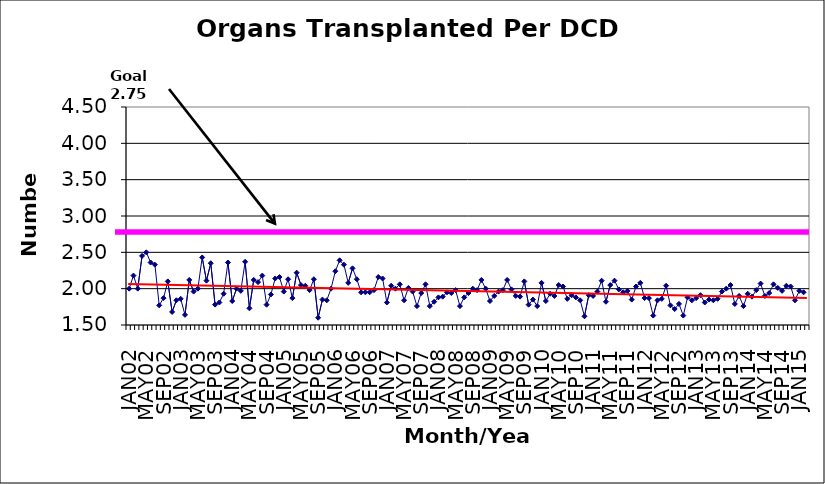
| Category | Series 0 |
|---|---|
| JAN02 | 2 |
| FEB02 | 2.18 |
| MAR02 | 2 |
| APR02 | 2.45 |
| MAY02 | 2.5 |
| JUN02 | 2.36 |
| JUL02 | 2.33 |
| AUG02 | 1.77 |
| SEP02 | 1.87 |
| OCT02 | 2.1 |
| NOV02 | 1.68 |
| DEC02 | 1.84 |
| JAN03 | 1.86 |
| FEB03 | 1.64 |
| MAR03 | 2.12 |
| APR03 | 1.96 |
| MAY03 | 2 |
| JUN03 | 2.43 |
| JUL03 | 2.11 |
| AUG03 | 2.35 |
| SEP03 | 1.78 |
| OCT03 | 1.81 |
| NOV03 | 1.93 |
| DEC03 | 2.36 |
| JAN04 | 1.83 |
| FEB04 | 2 |
| MAR04 | 1.97 |
| APR04 | 2.37 |
| MAY04 | 1.73 |
| JUN04 | 2.12 |
| JUL04 | 2.09 |
| AUG04 | 2.18 |
| SEP04 | 1.78 |
| OCT04 | 1.92 |
| NOV04 | 2.14 |
| DEC04 | 2.16 |
| JAN05 | 1.96 |
| FEB05 | 2.13 |
| MAR05 | 1.87 |
| APR05 | 2.22 |
| MAY05 | 2.05 |
| JUN05 | 2.04 |
| JUL05 | 1.98 |
| AUG05 | 2.13 |
| SEP05 | 1.6 |
| OCT05 | 1.85 |
| NOV05 | 1.84 |
| DEC05 | 2 |
| JAN06 | 2.24 |
| FEB06 | 2.39 |
| MAR06 | 2.33 |
| APR06 | 2.08 |
| MAY06 | 2.28 |
| JUN06 | 2.13 |
| JUL06 | 1.95 |
| AUG06 | 1.95 |
| SEP06 | 1.95 |
| OCT06 | 1.98 |
| NOV06 | 2.16 |
| DEC06 | 2.14 |
| JAN07 | 1.81 |
| FEB07 | 2.04 |
| MAR07 | 2 |
| APR07 | 2.06 |
| MAY07 | 1.84 |
| JUN07 | 2.01 |
| JUL07 | 1.96 |
| AUG07 | 1.76 |
| SEP07 | 1.94 |
| OCT07 | 2.06 |
| NOV07 | 1.76 |
| DEC07 | 1.82 |
| JAN08 | 1.88 |
| FEB08 | 1.89 |
| MAR08 | 1.95 |
| APR08 | 1.94 |
| MAY08 | 1.98 |
| JUN08 | 1.76 |
| JUL08 | 1.88 |
| AUG08 | 1.94 |
| SEP08 | 2 |
| OCT08 | 1.98 |
| NOV08 | 2.12 |
| DEC08 | 2 |
| JAN09 | 1.83 |
| FEB09 | 1.9 |
| MAR09 | 1.96 |
| APR09 | 1.98 |
| MAY09 | 2.12 |
| JUN09 | 1.99 |
| JUL09 | 1.9 |
| AUG09 | 1.89 |
| SEP09 | 2.1 |
| OCT09 | 1.78 |
| NOV09 | 1.85 |
| DEC09 | 1.76 |
| JAN10 | 2.08 |
| FEB10 | 1.83 |
| MAR10 | 1.93 |
| APR10 | 1.9 |
| MAY10 | 2.05 |
| JUN10 | 2.03 |
| JUL10 | 1.86 |
| AUG10 | 1.91 |
| SEP10 | 1.88 |
| OCT10 | 1.84 |
| NOV10 | 1.62 |
| DEC10 | 1.91 |
| JAN11 | 1.9 |
| FEB11 | 1.96 |
| MAR11 | 2.11 |
| APR11 | 1.82 |
| MAY11 | 2.05 |
| JUN11 | 2.11 |
| JUL11 | 1.99 |
| AUG11 | 1.95 |
| SEP11 | 1.97 |
| OCT11 | 1.85 |
| NOV11 | 2.03 |
| DEC11 | 2.08 |
| JAN12 | 1.87 |
| FEB12 | 1.87 |
| MAR12 | 1.63 |
| APR12 | 1.84 |
| MAY12 | 1.86 |
| JUN12 | 2.04 |
| JUL12 | 1.77 |
| AUG12 | 1.72 |
| SEP12 | 1.79 |
| OCT12 | 1.63 |
| NOV12 | 1.88 |
| DEC12 | 1.84 |
| JAN13 | 1.87 |
| FEB13 | 1.91 |
| MAR13 | 1.81 |
| APR13 | 1.85 |
| MAY13 | 1.84 |
| JUN13 | 1.86 |
| JUL13 | 1.96 |
| AUG13 | 2 |
| SEP13 | 2.05 |
| OCT13 | 1.79 |
| NOV13 | 1.9 |
| DEC13 | 1.76 |
| JAN14 | 1.93 |
| FEB14 | 1.89 |
| MAR14 | 1.98 |
| APR14 | 2.07 |
| MAY14 | 1.9 |
| JUN14 | 1.94 |
| JUL14 | 2.06 |
| AUG14 | 2.01 |
| SEP14 | 1.97 |
| OCT14 | 2.04 |
| NOV14 | 2.03 |
| DEC14 | 1.84 |
| JAN15 | 1.97 |
| FEB15 | 1.95 |